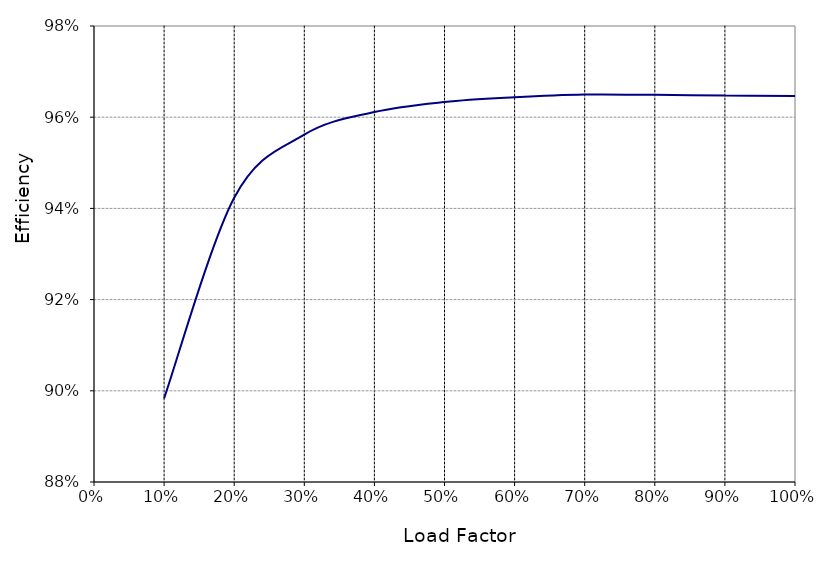
| Category | Series1 |
|---|---|
| 0.1 | 0.898 |
| 0.2 | 0.942 |
| 0.3 | 0.956 |
| 0.4 | 0.961 |
| 0.5 | 0.963 |
| 0.6 | 0.964 |
| 0.7 | 0.965 |
| 0.8 | 0.965 |
| 0.9 | 0.965 |
| 1.0 | 0.965 |